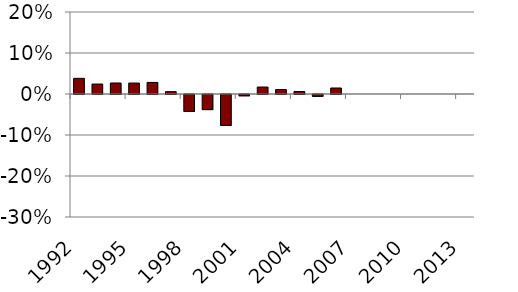
| Category | Series 0 |
|---|---|
| 1992.0 | 0.038 |
| 1993.0 | 0.024 |
| 1994.0 | 0.027 |
| 1995.0 | 0.027 |
| 1996.0 | 0.028 |
| 1997.0 | 0.006 |
| 1998.0 | -0.041 |
| 1999.0 | -0.037 |
| 2000.0 | -0.075 |
| 2001.0 | -0.003 |
| 2002.0 | 0.017 |
| 2003.0 | 0.011 |
| 2004.0 | 0.006 |
| 2005.0 | -0.005 |
| 2006.0 | 0.015 |
| 2007.0 | 0 |
| 2008.0 | 0 |
| 2009.0 | 0 |
| 2010.0 | 0 |
| 2011.0 | 0 |
| 2012.0 | 0 |
| 2013.0 | 0 |